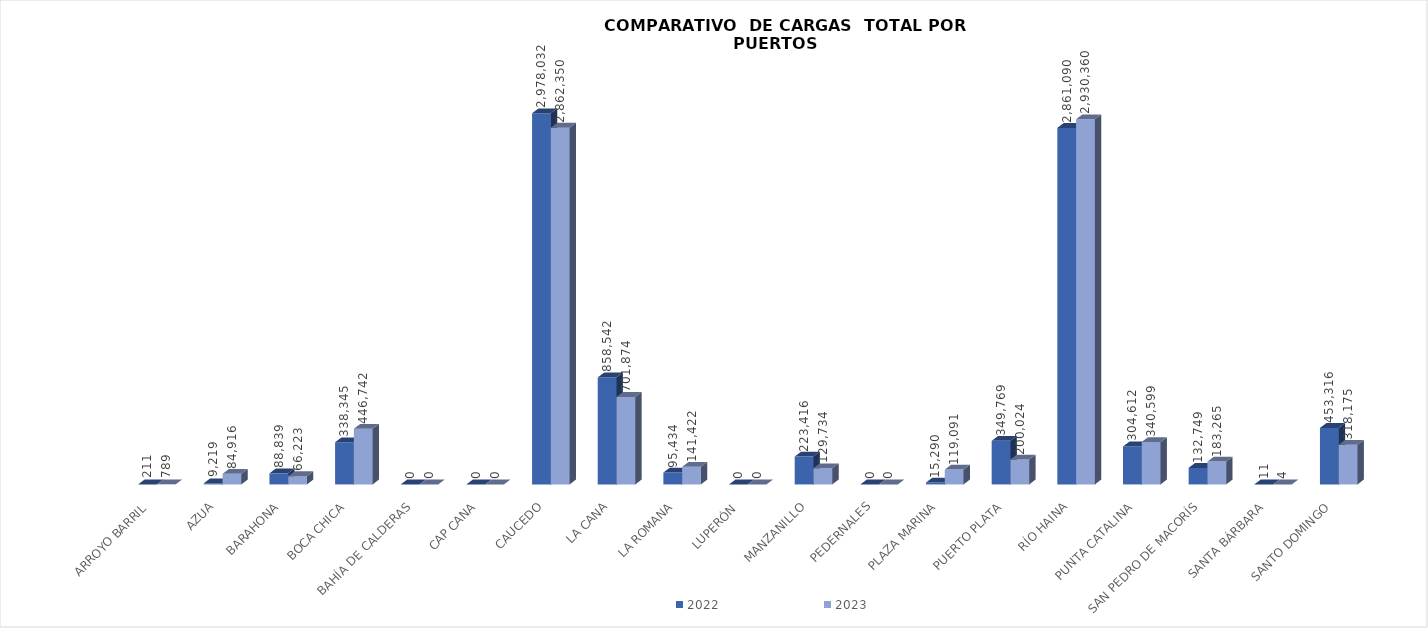
| Category | 2022 | 2023 |
|---|---|---|
| ARROYO BARRIL | 211 | 789 |
| AZUA | 9219 | 84916 |
| BARAHONA | 88839 | 66223 |
| BOCA CHICA | 338345 | 446742 |
| BAHÍA DE CALDERAS | 0 | 0 |
| CAP CANA | 0 | 0 |
| CAUCEDO | 2978032 | 2862350 |
| LA CANA | 858542 | 701874 |
| LA ROMANA | 95434 | 141422 |
| LUPERÓN  | 0 | 0 |
| MANZANILLO | 223416 | 129734 |
| PEDERNALES | 0 | 0 |
| PLAZA MARINA | 15290.35 | 119091 |
| PUERTO PLATA | 349769 | 200024 |
| RÍO HAINA | 2861090 | 2930360 |
| PUNTA CATALINA | 304612 | 340599 |
| SAN PEDRO DE MACORÍS | 132749.08 | 183265 |
| SANTA BÁRBARA | 11 | 4 |
| SANTO DOMINGO | 453316 | 318175 |